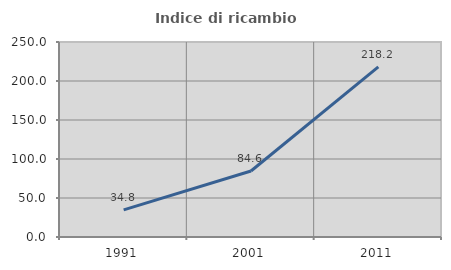
| Category | Indice di ricambio occupazionale  |
|---|---|
| 1991.0 | 34.783 |
| 2001.0 | 84.615 |
| 2011.0 | 218.182 |